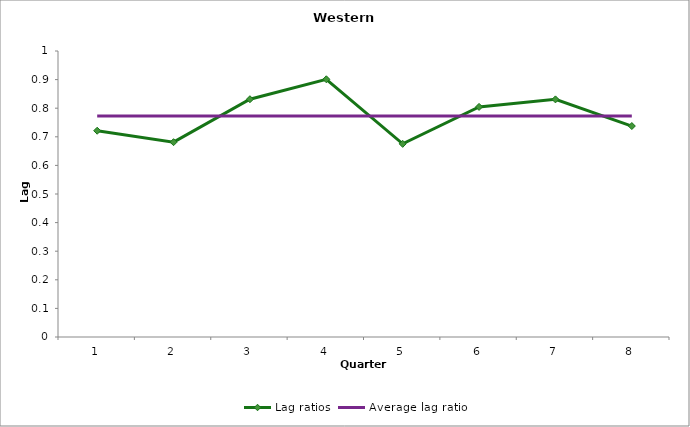
| Category | Lag ratios | Average lag ratio |
|---|---|---|
| 0 | 0.721 | 0.773 |
| 1 | 0.681 | 0.773 |
| 2 | 0.831 | 0.773 |
| 3 | 0.901 | 0.773 |
| 4 | 0.675 | 0.773 |
| 5 | 0.805 | 0.773 |
| 6 | 0.831 | 0.773 |
| 7 | 0.738 | 0.773 |